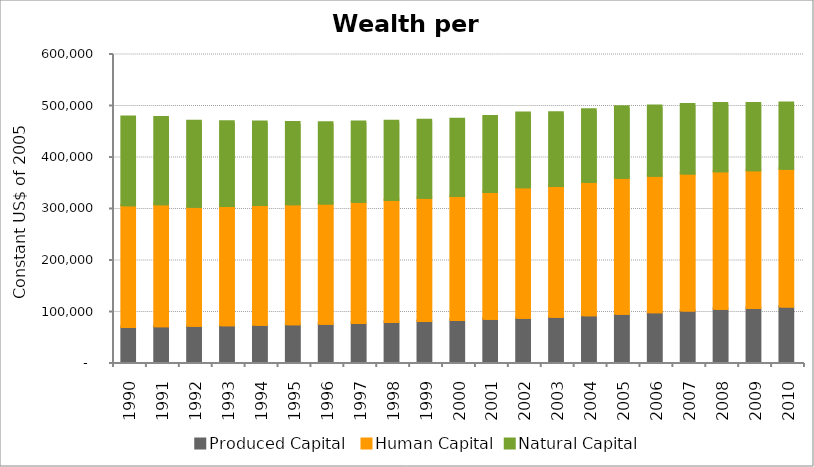
| Category | Produced Capital  | Human Capital | Natural Capital |
|---|---|---|---|
| 1990.0 | 68202.073 | 236158.209 | 171485.772 |
| 1991.0 | 69353.765 | 236736.509 | 168758.244 |
| 1992.0 | 70311.354 | 230983.236 | 166173.529 |
| 1993.0 | 71126.428 | 231594.691 | 163712.909 |
| 1994.0 | 72218.651 | 232439.36 | 161359.73 |
| 1995.0 | 73146.408 | 232944.523 | 159089.491 |
| 1996.0 | 74218.512 | 233446.372 | 156922.602 |
| 1997.0 | 75934.215 | 235387.808 | 154837.286 |
| 1998.0 | 77664.58 | 237078.679 | 152796.653 |
| 1999.0 | 79642.466 | 239083.984 | 150762.269 |
| 2000.0 | 81710.74 | 240787.768 | 148678.785 |
| 2001.0 | 83820.48 | 246163.506 | 146544.995 |
| 2002.0 | 85829.587 | 253282.39 | 144376.329 |
| 2003.0 | 88030.435 | 253798.773 | 142187.859 |
| 2004.0 | 90539.111 | 259314.899 | 140002.575 |
| 2005.0 | 93483.86 | 264494.096 | 137844.74 |
| 2006.0 | 96721.257 | 264759.75 | 135713.243 |
| 2007.0 | 99986.896 | 266243.317 | 133619.68 |
| 2008.0 | 103174.588 | 267163.987 | 131586.712 |
| 2009.0 | 105085.189 | 267415.218 | 129629.986 |
| 2010.0 | 107560.778 | 267681.795 | 127729.082 |